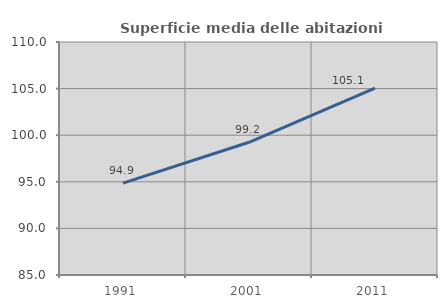
| Category | Superficie media delle abitazioni occupate |
|---|---|
| 1991.0 | 94.863 |
| 2001.0 | 99.243 |
| 2011.0 | 105.057 |